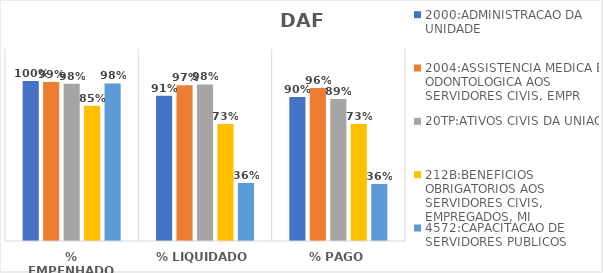
| Category | 2000:ADMINISTRACAO DA UNIDADE | 2004:ASSISTENCIA MEDICA E ODONTOLOGICA AOS SERVIDORES CIVIS, EMPR | 20TP:ATIVOS CIVIS DA UNIAO | 212B:BENEFICIOS OBRIGATORIOS AOS SERVIDORES CIVIS, EMPREGADOS, MI | 4572:CAPACITACAO DE SERVIDORES PUBLICOS FEDERAIS EM PROCESSO DE Q |
|---|---|---|---|---|---|
| % EMPENHADO | 0.999 | 0.994 | 0.982 | 0.846 | 0.985 |
| % LIQUIDADO | 0.908 | 0.974 | 0.978 | 0.732 | 0.363 |
| % PAGO | 0.9 | 0.956 | 0.888 | 0.732 | 0.356 |